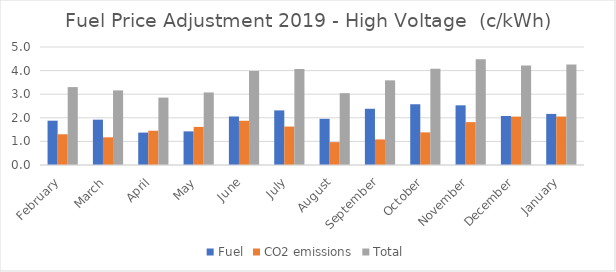
| Category | Fuel | CO2 emissions | Total |
|---|---|---|---|
| February | 1.878 | 1.303 | 3.301 |
| March | 1.92 | 1.173 | 3.161 |
| April | 1.372 | 1.452 | 2.856 |
| May | 1.425 | 1.614 | 3.074 |
| June | 2.056 | 1.875 | 3.985 |
| July | 2.314 | 1.629 | 4.066 |
| August | 1.957 | 0.969 | 3.043 |
| September | 2.382 | 1.084 | 3.586 |
| October | 2.574 | 1.383 | 4.074 |
| November | 2.529 | 1.817 | 4.478 |
| December | 2.078 | 2.052 | 4.216 |
| January | 2.164 | 2.053 | 4.259 |